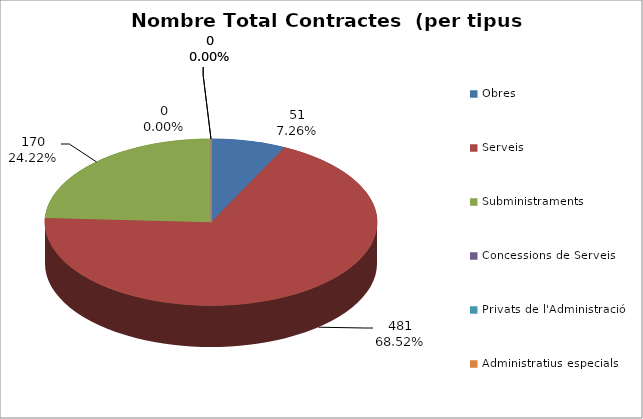
| Category | Nombre Total Contractes |
|---|---|
| Obres | 51 |
| Serveis | 481 |
| Subministraments | 170 |
| Concessions de Serveis | 0 |
| Privats de l'Administració | 0 |
| Administratius especials | 0 |